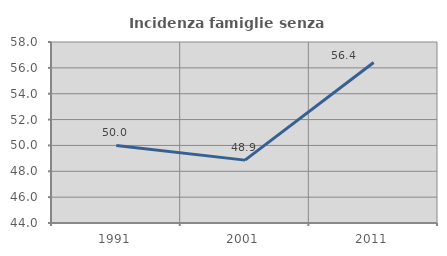
| Category | Incidenza famiglie senza nuclei |
|---|---|
| 1991.0 | 50 |
| 2001.0 | 48.864 |
| 2011.0 | 56.41 |